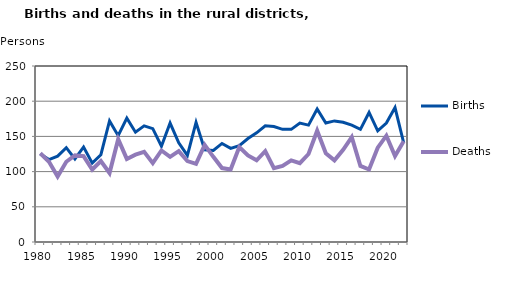
| Category | Births | Deaths |
|---|---|---|
| 1980.0 | 125 | 126 |
| 1981.0 | 117 | 114 |
| 1982.0 | 122 | 93 |
| 1983.0 | 134 | 114 |
| 1984.0 | 118 | 123 |
| 1985.0 | 135 | 122 |
| 1986.0 | 112 | 103 |
| 1987.0 | 124 | 115 |
| 1988.0 | 172 | 98 |
| 1989.0 | 151 | 146 |
| 1990.0 | 176 | 118 |
| 1991.0 | 156 | 124 |
| 1992.0 | 165 | 128 |
| 1993.0 | 161 | 112 |
| 1994.0 | 136 | 130 |
| 1995.0 | 169 | 121 |
| 1996.0 | 141 | 129 |
| 1997.0 | 123 | 115 |
| 1998.0 | 170 | 111 |
| 1999.0 | 131 | 138 |
| 2000.0 | 130 | 121 |
| 2001.0 | 140 | 105 |
| 2002.0 | 133 | 103 |
| 2003.0 | 137 | 135 |
| 2004.0 | 147 | 123 |
| 2005.0 | 155 | 116 |
| 2006.0 | 165 | 129 |
| 2007.0 | 164 | 105 |
| 2008.0 | 160 | 108 |
| 2009.0 | 160 | 116 |
| 2010.0 | 169 | 112 |
| 2011.0 | 166 | 125 |
| 2012.0 | 189 | 158 |
| 2013.0 | 169 | 126 |
| 2014.0 | 172 | 116 |
| 2015.0 | 170 | 131 |
| 2016.0 | 166 | 149 |
| 2017.0 | 160 | 108 |
| 2018.0 | 184 | 103 |
| 2019.0 | 158 | 134 |
| 2020.0 | 169 | 151 |
| 2021.0 | 191 | 122 |
| 2022.0 | 141 | 143 |